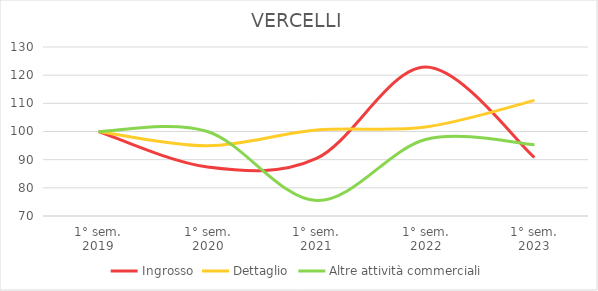
| Category | Ingrosso | Dettaglio | Altre attività commerciali |
|---|---|---|---|
| 1° sem.
2019 | 100 | 100 | 100 |
| 1° sem.
2020 | 87.372 | 94.912 | 100 |
| 1° sem.
2021 | 90.444 | 100.526 | 75.472 |
| 1° sem.
2022 | 122.867 | 101.579 | 97.17 |
| 1° sem.
2023 | 90.785 | 111.053 | 95.283 |